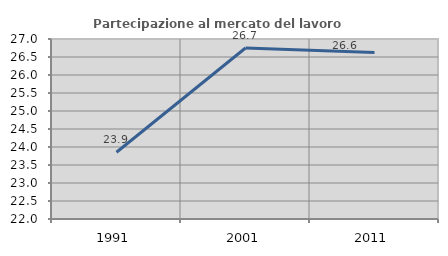
| Category | Partecipazione al mercato del lavoro  femminile |
|---|---|
| 1991.0 | 23.854 |
| 2001.0 | 26.749 |
| 2011.0 | 26.627 |